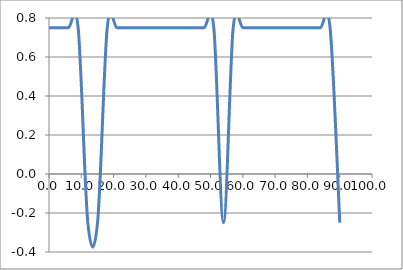
| Category | Elevation (in.) |
|---|---|
| 0.024 | 0.75 |
| 3.024 | 0.75 |
| 6.024 | 0.75 |
| 9.024000000000001 | 0.75 |
| 12.024000000000001 | -0.25 |
| 15.024000000000001 | -0.25 |
| 18.024 | 0.75 |
| 21.024 | 0.75 |
| 24.023999999999997 | 0.75 |
| 27.023999999999997 | 0.75 |
| 30.023999999999997 | 0.75 |
| 33.024 | 0.75 |
| 36.024 | 0.75 |
| 39.024 | 0.75 |
| 42.024 | 0.75 |
| 45.024 | 0.75 |
| 48.024 | 0.75 |
| 51.024 | 0.75 |
| 54.024 | -0.25 |
| 57.024 | 0.75 |
| 60.024 | 0.75 |
| 63.024 | 0.75 |
| 66.024 | 0.75 |
| 69.024 | 0.75 |
| 72.024 | 0.75 |
| 75.024 | 0.75 |
| 78.024 | 0.75 |
| 81.024 | 0.75 |
| 84.024 | 0.75 |
| 87.024 | 0.75 |
| 90.024 | -0.25 |